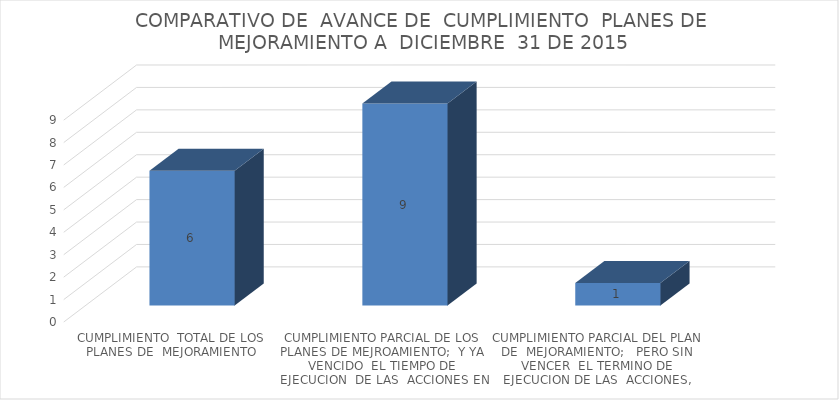
| Category | Series 0 |
|---|---|
| CUMPLIMIENTO  TOTAL DE LOS PLANES DE  MEJORAMIENTO | 6 |
| CUMPLIMIENTO PARCIAL DE LOS  PLANES DE MEJROAMIENTO;  Y YA  VENCIDO  EL TIEMPO DE  EJECUCION  DE LAS  ACCIONES EN LA VIGENCIA 2014 Y 2015 | 9 |
| CUMPLIMIENTO PARCIAL DEL PLAN DE  MEJORAMIENTO;   PERO SIN VENCER  EL TERMINO DE EJECUCION DE LAS  ACCIONES, VENCE EN LA  VIGENCIA 2016 | 1 |